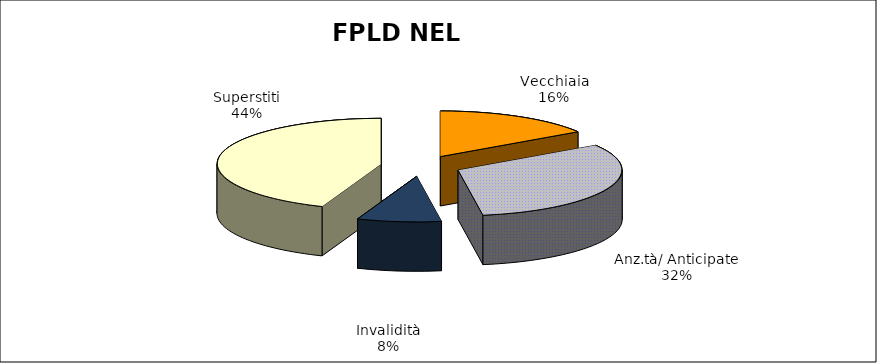
| Category | Series 0 |
|---|---|
| Vecchiaia | 10926 |
| Anz.tà/ Anticipate | 21924 |
| Invalidità | 5721 |
| Superstiti | 30473 |